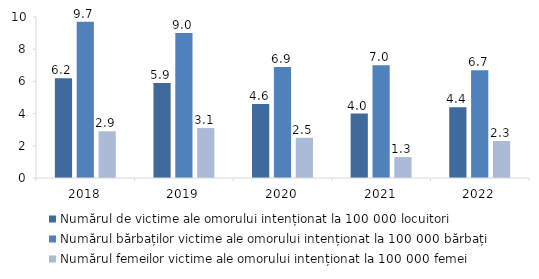
| Category | Numărul de victime ale omorului intenționat la 100 000 locuitori | Numărul bărbaților victime ale omorului intenționat la 100 000 bărbați | Numărul femeilor victime ale omorului intenționat la 100 000 femei |
|---|---|---|---|
| 2018.0 | 6.2 | 9.7 | 2.9 |
| 2019.0 | 5.9 | 9 | 3.1 |
| 2020.0 | 4.6 | 6.9 | 2.5 |
| 2021.0 | 4 | 7 | 1.3 |
| 2022.0 | 4.4 | 6.7 | 2.3 |